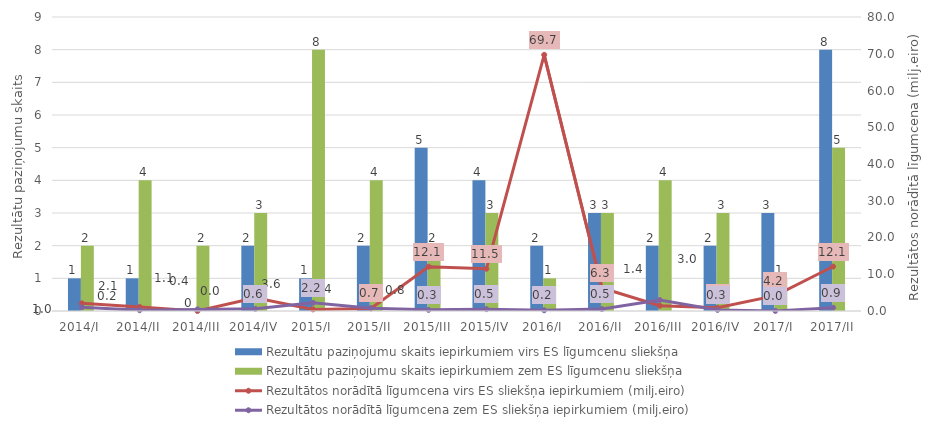
| Category | Rezultātu paziņojumu skaits iepirkumiem virs ES līgumcenu sliekšņa | Rezultātu paziņojumu skaits iepirkumiem zem ES līgumcenu sliekšņa |
|---|---|---|
| 2014/I | 1 | 2 |
| 2014/II | 1 | 4 |
| 2014/III | 0 | 2 |
| 2014/IV | 2 | 3 |
| 2015/I | 1 | 8 |
| 2015/II | 2 | 4 |
| 2015/III | 5 | 2 |
| 2015/IV | 4 | 3 |
| 2016/I | 2 | 1 |
| 2016/II | 3 | 3 |
| 2016/III | 2 | 4 |
| 2016/IV | 2 | 3 |
| 2017/I | 3 | 1 |
| 2017/II | 8 | 5 |